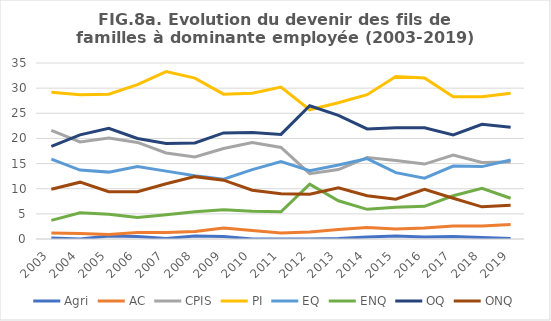
| Category | Agri | AC | CPIS | PI | EQ | ENQ | OQ | ONQ |
|---|---|---|---|---|---|---|---|---|
| 2003.0 | 0.2 | 1.2 | 21.6 | 29.2 | 15.9 | 3.7 | 18.4 | 9.9 |
| 2004.0 | 0 | 1.1 | 19.3 | 28.7 | 13.7 | 5.2 | 20.7 | 11.3 |
| 2005.0 | 0.6 | 0.9 | 20.1 | 28.8 | 13.3 | 4.9 | 22 | 9.4 |
| 2006.0 | 0.5 | 1.3 | 19.2 | 30.7 | 14.4 | 4.3 | 20 | 9.4 |
| 2007.0 | 0.1 | 1.3 | 17.1 | 33.3 | 13.5 | 4.8 | 19 | 11 |
| 2008.0 | 0.6 | 1.5 | 16.3 | 32 | 12.6 | 5.4 | 19.1 | 12.4 |
| 2009.0 | 0.5 | 2.2 | 18 | 28.8 | 11.9 | 5.8 | 21.1 | 11.7 |
| 2010.0 | 0 | 1.7 | 19.2 | 29 | 13.8 | 5.5 | 21.2 | 9.7 |
| 2011.0 | 0 | 1.2 | 18.2 | 30.2 | 15.4 | 5.4 | 20.8 | 9 |
| 2012.0 | 0 | 1.4 | 13 | 25.7 | 13.6 | 10.9 | 26.5 | 8.9 |
| 2013.0 | 0.1 | 1.9 | 13.8 | 27.1 | 14.7 | 7.6 | 24.6 | 10.2 |
| 2014.0 | 0.4 | 2.3 | 16.2 | 28.7 | 16 | 5.9 | 21.9 | 8.6 |
| 2015.0 | 0.6 | 2 | 15.6 | 32.3 | 13.2 | 6.3 | 22.1 | 7.9 |
| 2016.0 | 0.4 | 2.2 | 14.9 | 32 | 12.1 | 6.5 | 22.1 | 9.9 |
| 2017.0 | 0.5 | 2.6 | 16.7 | 28.3 | 14.5 | 8.6 | 20.7 | 8.1 |
| 2018.0 | 0.3 | 2.6 | 15.2 | 28.3 | 14.4 | 10.1 | 22.8 | 6.4 |
| 2019.0 | 0.1 | 2.9 | 15.3 | 29 | 15.7 | 8.1 | 22.2 | 6.7 |